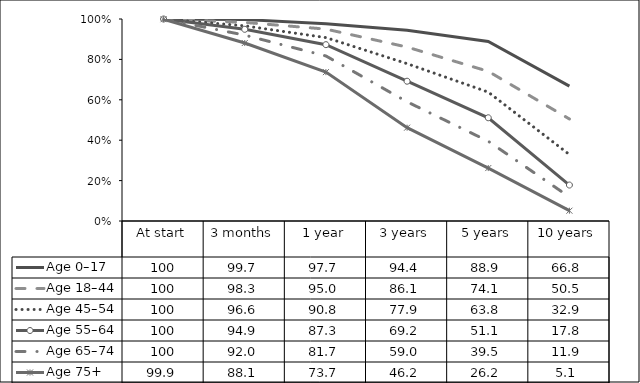
| Category | Age 0–17 | Age 18–44  | Age 45–54  | Age 55–64  | Age 65–74  | Age 75+  |
|---|---|---|---|---|---|---|
| At start | 100 | 100 | 100 | 100 | 100 | 99.9 |
| 3 months | 99.7 | 98.3 | 96.6 | 94.9 | 92 | 88.1 |
| 1 year | 97.7 | 95 | 90.8 | 87.3 | 81.7 | 73.7 |
| 3 years | 94.4 | 86.1 | 77.9 | 69.2 | 59 | 46.2 |
| 5 years | 88.9 | 74.1 | 63.8 | 51.1 | 39.5 | 26.2 |
| 10 years | 66.8 | 50.5 | 32.9 | 17.8 | 11.9 | 5.1 |